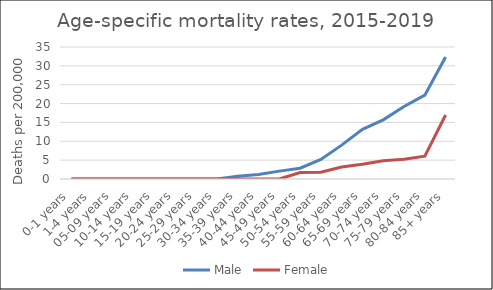
| Category | Male | Female |
|---|---|---|
| 0-1 years | 0 | 0 |
| 1-4 years | 0 | 0 |
| 05-09 years | 0 | 0 |
| 10-14 years | 0 | 0 |
| 15-19 years | 0 | 0 |
| 20-24 years | 0 | 0 |
| 25-29 years | 0 | 0 |
| 30-34 years | 0 | 0 |
| 35-39 years | 0.72 | 0 |
| 40-44 years | 1.17 | 0 |
| 45-49 years | 2.09 | 0 |
| 50-54 years | 2.87 | 1.7 |
| 55-59 years | 5.17 | 1.81 |
| 60-64 years | 8.98 | 3.19 |
| 65-69 years | 13.15 | 3.93 |
| 70-74 years | 15.68 | 4.81 |
| 75-79 years | 19.21 | 5.21 |
| 80-84 years | 22.23 | 6.06 |
| 85+ years | 32.36 | 16.97 |